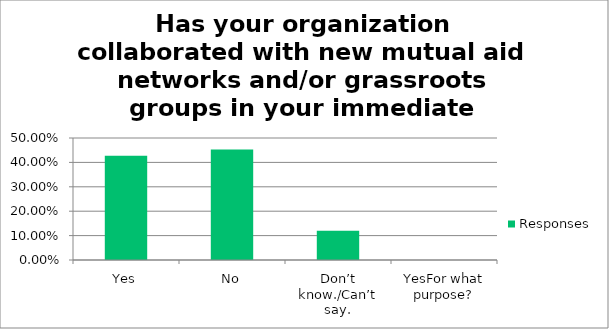
| Category | Responses |
|---|---|
| Yes | 0.427 |
| No | 0.453 |
| Don’t know./Can’t say. | 0.12 |
| YesFor what purpose? | 0 |